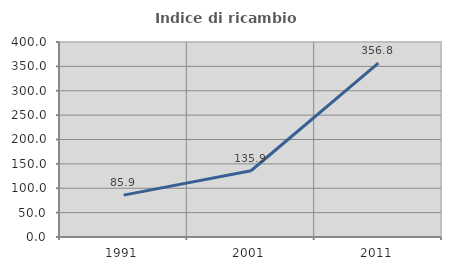
| Category | Indice di ricambio occupazionale  |
|---|---|
| 1991.0 | 85.859 |
| 2001.0 | 135.897 |
| 2011.0 | 356.818 |